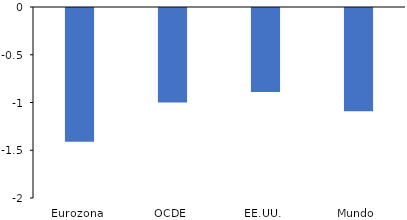
| Category | Total |
|---|---|
| Eurozona | -1.4 |
| OCDE | -0.99 |
| EE.UU. | -0.88 |
| Mundo | -1.08 |